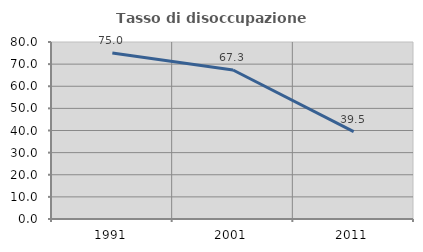
| Category | Tasso di disoccupazione giovanile  |
|---|---|
| 1991.0 | 75 |
| 2001.0 | 67.347 |
| 2011.0 | 39.474 |